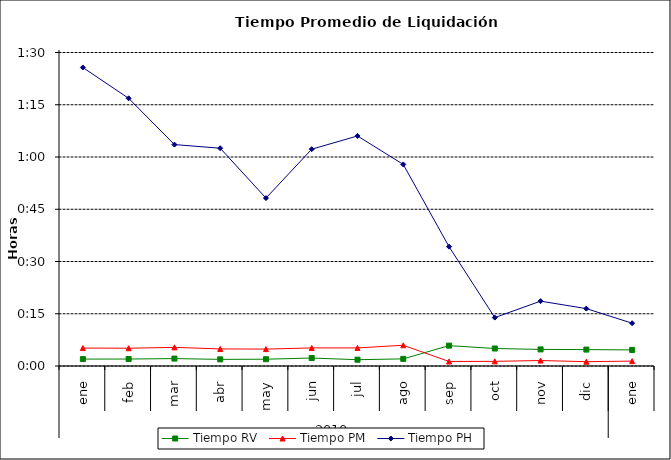
| Category | Tiempo RV | Tiempo PM | Tiempo PH |
|---|---|---|---|
| 0 | 0.001 | 0.004 | 0.06 |
| 1 | 0.001 | 0.004 | 0.053 |
| 2 | 0.001 | 0.004 | 0.044 |
| 3 | 0.001 | 0.003 | 0.043 |
| 4 | 0.001 | 0.003 | 0.033 |
| 5 | 0.002 | 0.004 | 0.043 |
| 6 | 0.001 | 0.004 | 0.046 |
| 7 | 0.001 | 0.004 | 0.04 |
| 8 | 0.004 | 0.001 | 0.024 |
| 9 | 0.003 | 0.001 | 0.01 |
| 10 | 0.003 | 0.001 | 0.013 |
| 11 | 0.003 | 0.001 | 0.011 |
| 12 | 0.003 | 0.001 | 0.009 |